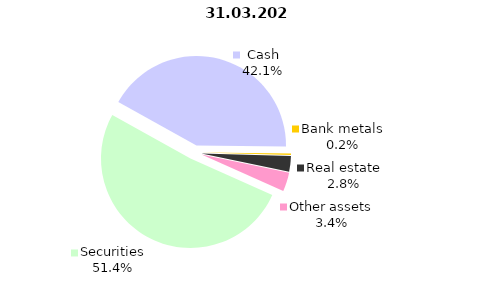
| Category | 03.31.2020 |
|---|---|
| Securities | 1597.5 |
| Cash | 1307.5 |
| Bank metals | 7.6 |
| Real estate | 88.5 |
| Other assets | 105.4 |